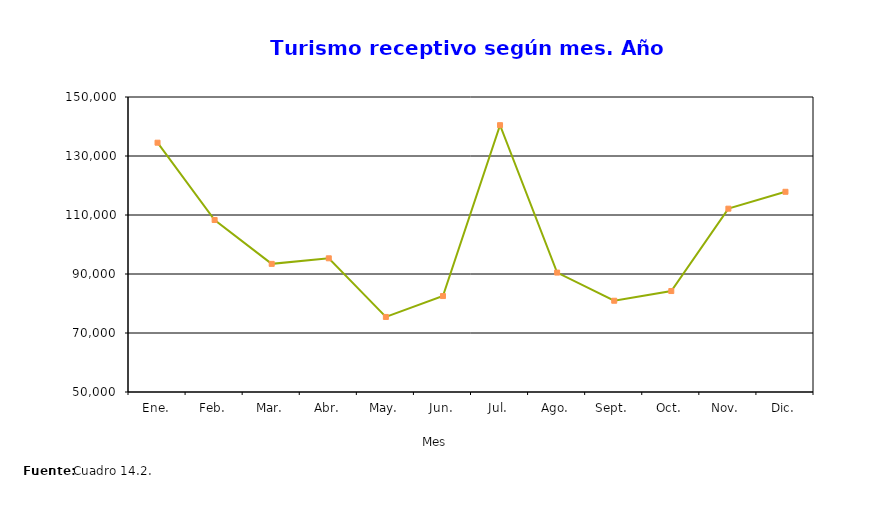
| Category | Series 0 |
|---|---|
| Ene. | 134510 |
| Feb. | 108309 |
| Mar. | 93437 |
| Abr. | 95319 |
| May. | 75440 |
| Jun. | 82525 |
| Jul. | 140449 |
| Ago. | 90481 |
| Sept. | 80934 |
| Oct. | 84226 |
| Nov. | 112148 |
| Dic. | 117867 |